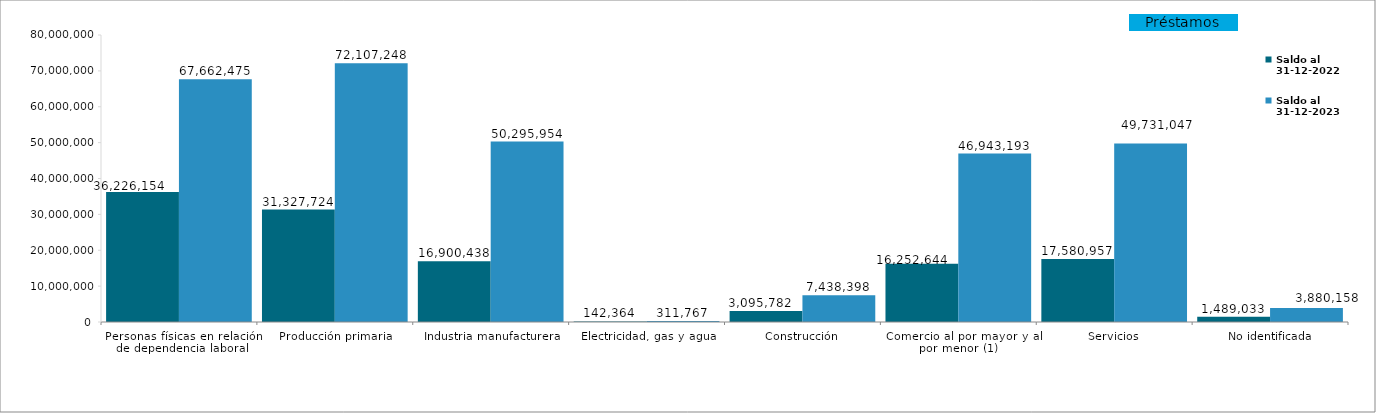
| Category | Saldo al
31-12-2022 | Saldo al
31-12-2023 |
|---|---|---|
| Personas físicas en relación de dependencia laboral | 36226154 | 67662475 |
| Producción primaria | 31327724 | 72107248 |
| Industria manufacturera | 16900438 | 50295954 |
| Electricidad, gas y agua | 142364 | 311767 |
| Construcción | 3095782 | 7438398 |
| Comercio al por mayor y al por menor (1)  | 16252644 | 46943193 |
| Servicios | 17580957 | 49731047 |
| No identificada | 1489033 | 3880158 |